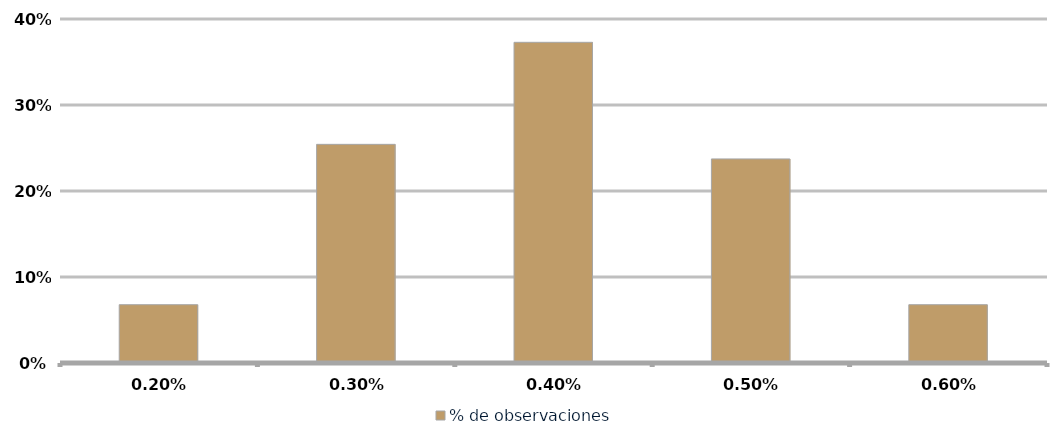
| Category | % de observaciones  |
|---|---|
| 0.002 | 0.068 |
| 0.003 | 0.254 |
| 0.004 | 0.373 |
| 0.005 | 0.237 |
| 0.006 | 0.068 |